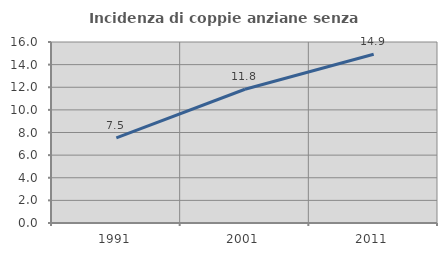
| Category | Incidenza di coppie anziane senza figli  |
|---|---|
| 1991.0 | 7.524 |
| 2001.0 | 11.825 |
| 2011.0 | 14.914 |